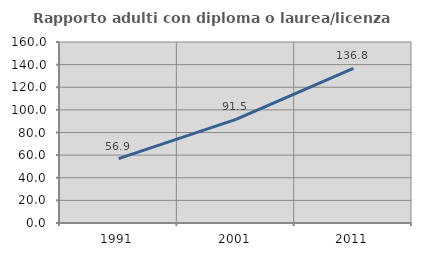
| Category | Rapporto adulti con diploma o laurea/licenza media  |
|---|---|
| 1991.0 | 56.897 |
| 2001.0 | 91.549 |
| 2011.0 | 136.782 |